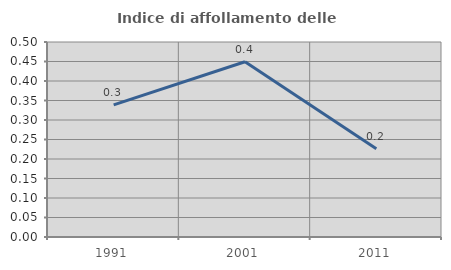
| Category | Indice di affollamento delle abitazioni  |
|---|---|
| 1991.0 | 0.339 |
| 2001.0 | 0.449 |
| 2011.0 | 0.226 |